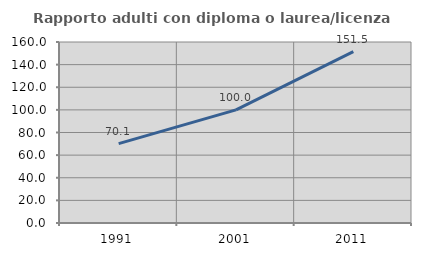
| Category | Rapporto adulti con diploma o laurea/licenza media  |
|---|---|
| 1991.0 | 70.13 |
| 2001.0 | 100 |
| 2011.0 | 151.471 |